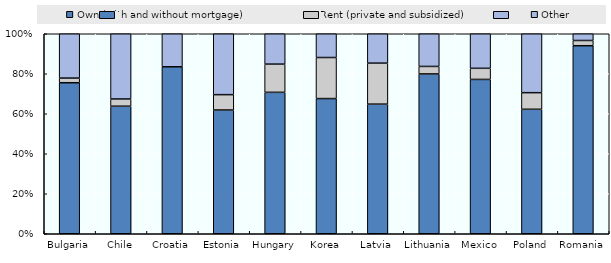
| Category | Own (with and without mortgage) | Rent (private and subsidized) | Other |
|---|---|---|---|
| Bulgaria | 0.755 | 0.023 | 0.222 |
| Chile | 0.638 | 0.036 | 0.326 |
| Croatia | 0.835 | 0 | 0.165 |
| Estonia | 0.619 | 0.077 | 0.304 |
| Hungary | 0.707 | 0.141 | 0.152 |
| Korea | 0.676 | 0.205 | 0.119 |
| Latvia | 0.648 | 0.205 | 0.147 |
| Lithuania | 0.799 | 0.037 | 0.163 |
| Mexico | 0.772 | 0.056 | 0.173 |
| Poland | 0.622 | 0.083 | 0.295 |
| Romania | 0.94 | 0.026 | 0.034 |